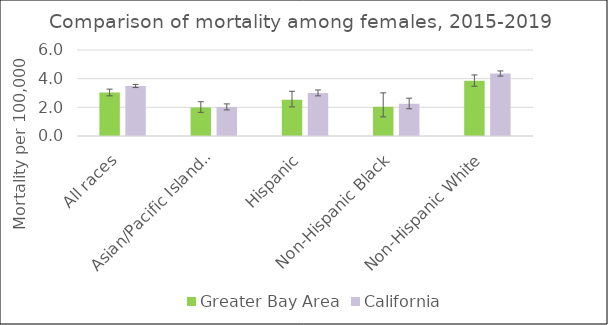
| Category | Greater Bay Area | California | US Mortality |
|---|---|---|---|
| All races | 3.03 | 3.49 |  |
| Asian/Pacific Islander | 1.99 | 2.02 |  |
| Hispanic | 2.53 | 3 |  |
| Non-Hispanic Black | 2.04 | 2.25 |  |
| Non-Hispanic White | 3.85 | 4.36 |  |